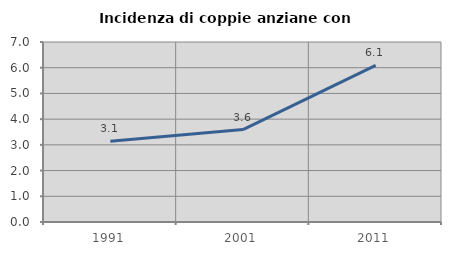
| Category | Incidenza di coppie anziane con figli |
|---|---|
| 1991.0 | 3.144 |
| 2001.0 | 3.593 |
| 2011.0 | 6.093 |